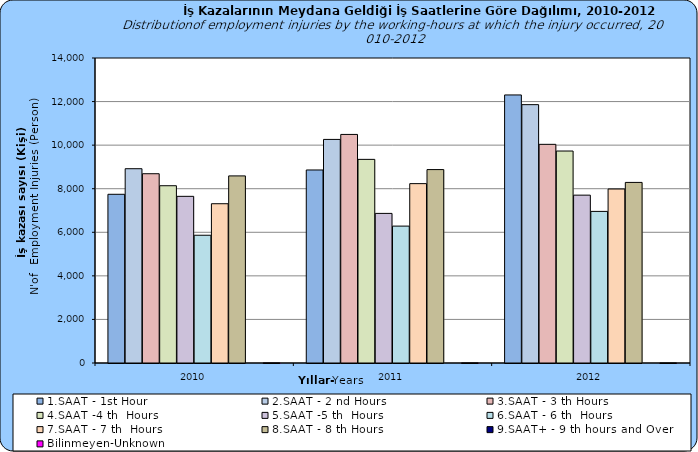
| Category | 1.SAAT - 1st Hour | 2.SAAT - 2 nd Hours | 3.SAAT - 3 th Hours | 4.SAAT -4 th  Hours | 5.SAAT -5 th  Hours | 6.SAAT - 6 th  Hours | 7.SAAT - 7 th  Hours | 8.SAAT - 8 th Hours | 9.SAAT+ - 9 th hours and Over | Bilinmeyen-Unknown |
|---|---|---|---|---|---|---|---|---|---|---|
| 2010 | 7744 | 8918 | 8688 | 8137 | 7650 | 5864 | 7311 | 8588 | 0 | 3 |
| 2011 | 8860 | 10263 | 10492 | 9347 | 6867 | 6284 | 8233 | 8878 | 0 | 3 |
| 2012 | 12304 | 11859 | 10037 | 9730 | 7705 | 6959 | 7987 | 8289 | 0 | 1 |